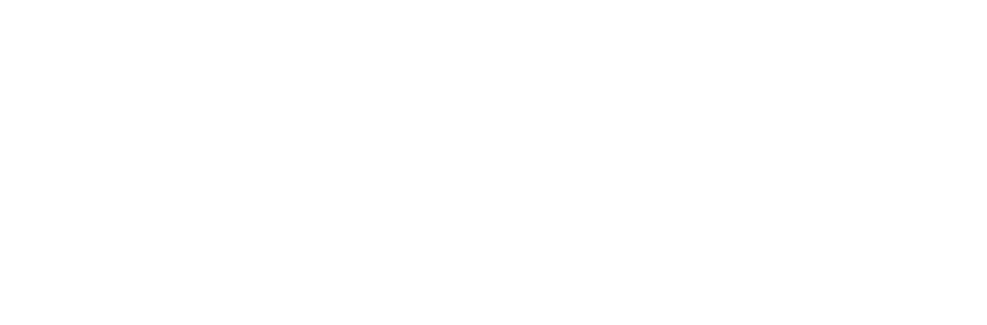
| Category | Total |
|---|---|
| 0 | 0.042 |
| 1 | 0.958 |